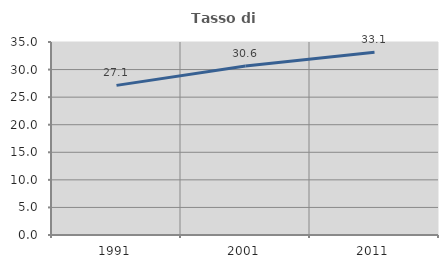
| Category | Tasso di occupazione   |
|---|---|
| 1991.0 | 27.136 |
| 2001.0 | 30.639 |
| 2011.0 | 33.146 |